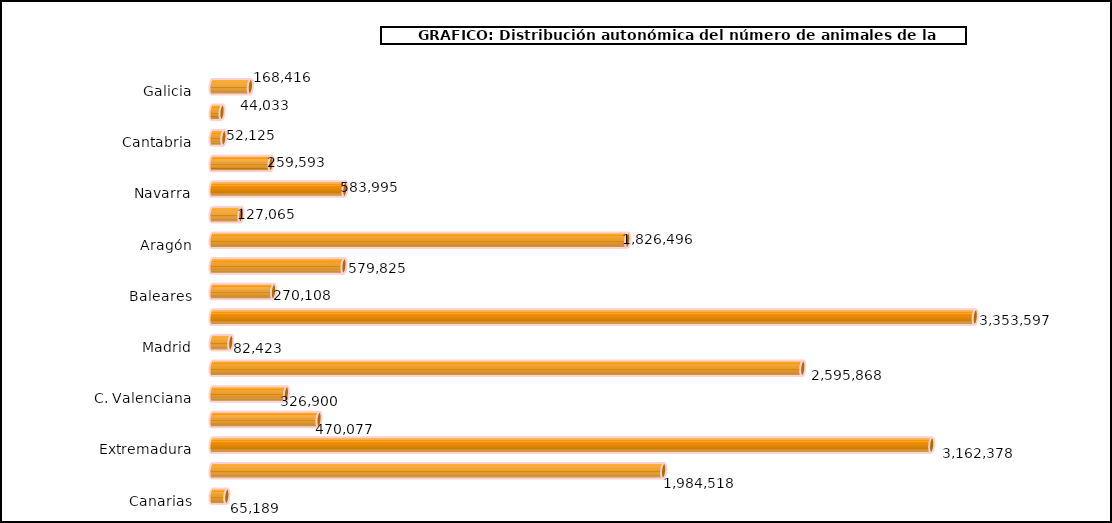
| Category | num. Animales |
|---|---|
|   Galicia | 168416 |
|   P. de Asturias | 44033 |
|   Cantabria | 52125 |
|   País Vasco | 259593 |
|   Navarra | 583995 |
|   La Rioja | 127065 |
|   Aragón | 1826496 |
|   Cataluña | 579825 |
|   Baleares | 270108 |
|   Castilla y León | 3353597 |
|   Madrid | 82423 |
|   Castilla – La Mancha | 2595868 |
|   C. Valenciana | 326900 |
|   R. de Murcia | 470077 |
|   Extremadura | 3162378 |
|   Andalucía | 1984518 |
|   Canarias | 65189 |